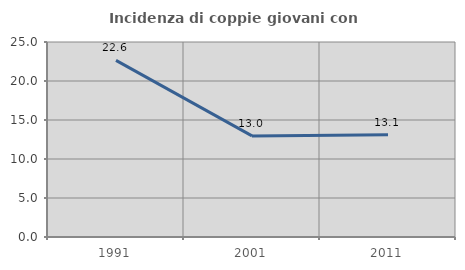
| Category | Incidenza di coppie giovani con figli |
|---|---|
| 1991.0 | 22.642 |
| 2001.0 | 12.963 |
| 2011.0 | 13.115 |